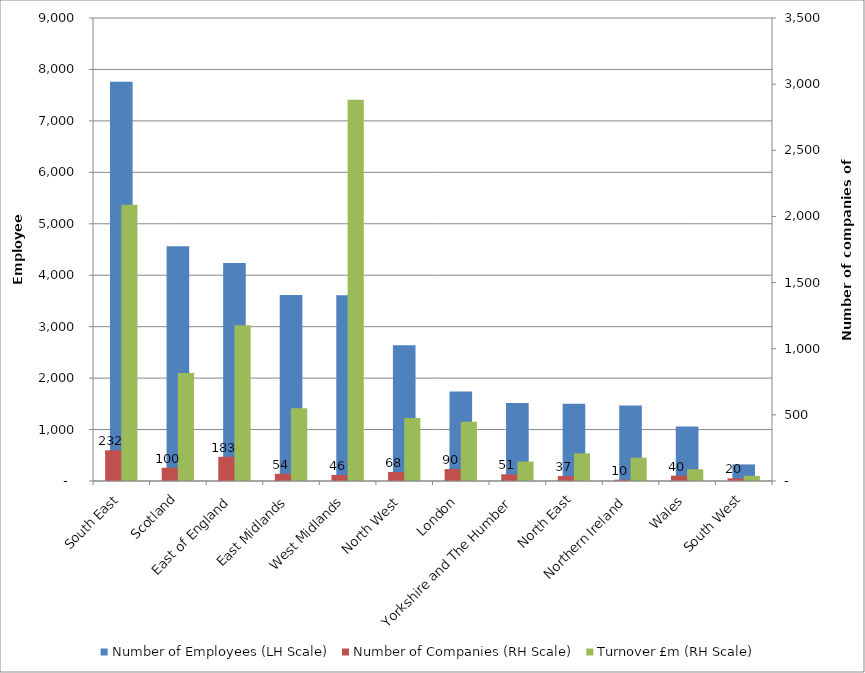
| Category | Number of Employees (LH Scale) |
|---|---|
| South East | 7760.05 |
| Scotland | 4562.4 |
| East of England | 4238.83 |
| East Midlands | 3613.6 |
| West Midlands | 3611.6 |
| North West | 2636.65 |
| London | 1740 |
| Yorkshire and The Humber | 1514.5 |
| North East | 1500.55 |
| Northern Ireland | 1468 |
| Wales | 1057.1 |
| South West | 322.3 |